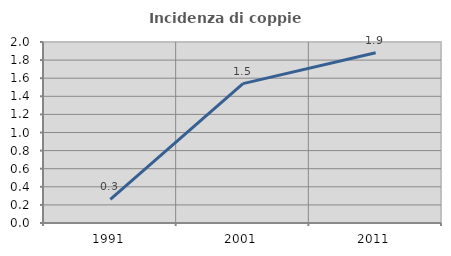
| Category | Incidenza di coppie miste |
|---|---|
| 1991.0 | 0.26 |
| 2001.0 | 1.54 |
| 2011.0 | 1.881 |